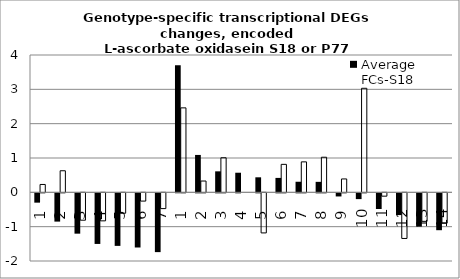
| Category | Average FCs-S18 | Average FCs-P77 |
|---|---|---|
| 1.0 | -0.271 | 0.229 |
| 2.0 | -0.823 | 0.628 |
| 3.0 | -1.175 | -0.797 |
| 4.0 | -1.474 | -0.816 |
| 5.0 | -1.53 | -0.594 |
| 6.0 | -1.578 | -0.24 |
| 7.0 | -1.712 | -0.459 |
| 1.0 | 3.699 | 2.46 |
| 2.0 | 1.089 | 0.329 |
| 3.0 | 0.611 | 1.007 |
| 4.0 | 0.571 | 0 |
| 5.0 | 0.438 | -1.167 |
| 6.0 | 0.42 | 0.815 |
| 7.0 | 0.308 | 0.887 |
| 8.0 | 0.306 | 1.023 |
| 9.0 | -0.091 | 0.39 |
| 10.0 | -0.168 | 3.031 |
| 11.0 | -0.456 | -0.097 |
| 12.0 | -0.633 | -1.329 |
| 13.0 | -0.969 | -0.831 |
| 14.0 | -1.074 | -0.884 |